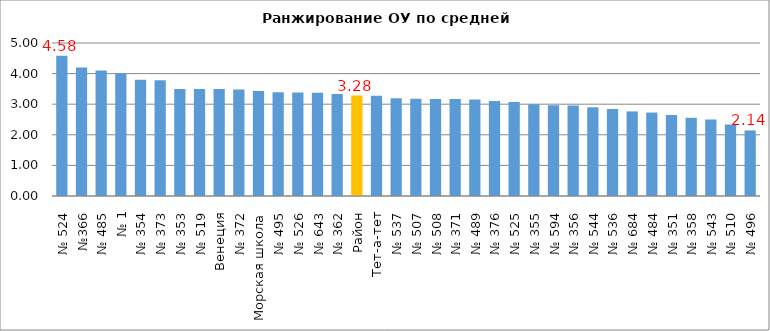
| Category | Оценка |
|---|---|
| № 524 | 4.581 |
| №366 | 4.196 |
| № 485 | 4.1 |
| № 1 | 4 |
| № 354 | 3.8 |
| № 373 | 3.786 |
| № 353 | 3.5 |
| № 519 | 3.5 |
| Венеция | 3.5 |
| № 372 | 3.478 |
| Морская школа | 3.429 |
| № 495 | 3.389 |
| № 526 | 3.385 |
| № 643 | 3.375 |
| № 362 | 3.333 |
| Район | 3.283 |
| Тет-а-тет | 3.273 |
| № 537 | 3.19 |
| № 507 | 3.178 |
| № 508 | 3.174 |
| № 371 | 3.167 |
| № 489 | 3.157 |
| № 376 | 3.104 |
| № 525 | 3.07 |
| № 355 | 3 |
| № 594 | 2.966 |
| № 356 | 2.961 |
| № 544 | 2.9 |
| № 536 | 2.846 |
| № 684 | 2.765 |
| № 484 | 2.727 |
| № 351 | 2.65 |
| № 358 | 2.556 |
| № 543 | 2.5 |
| № 510 | 2.333 |
| № 496 | 2.143 |